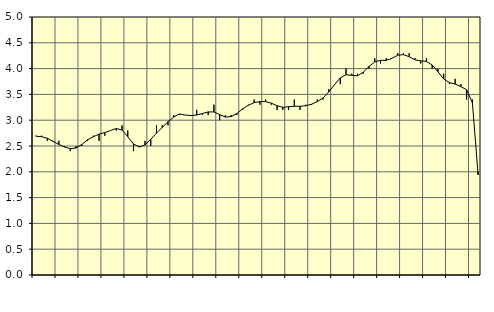
| Category | Piggar | Series 1 |
|---|---|---|
| nan | 2.7 | 2.69 |
| 1.0 | 2.7 | 2.68 |
| 1.0 | 2.6 | 2.65 |
| 1.0 | 2.6 | 2.59 |
| nan | 2.6 | 2.53 |
| 2.0 | 2.5 | 2.48 |
| 2.0 | 2.4 | 2.45 |
| 2.0 | 2.5 | 2.46 |
| nan | 2.5 | 2.53 |
| 3.0 | 2.6 | 2.62 |
| 3.0 | 2.7 | 2.68 |
| 3.0 | 2.6 | 2.73 |
| nan | 2.7 | 2.76 |
| 4.0 | 2.8 | 2.8 |
| 4.0 | 2.8 | 2.84 |
| 4.0 | 2.9 | 2.81 |
| nan | 2.8 | 2.68 |
| 5.0 | 2.4 | 2.54 |
| 5.0 | 2.5 | 2.48 |
| 5.0 | 2.6 | 2.52 |
| nan | 2.5 | 2.63 |
| 6.0 | 2.9 | 2.75 |
| 6.0 | 2.9 | 2.86 |
| 6.0 | 2.9 | 2.97 |
| nan | 3.1 | 3.06 |
| 7.0 | 3.1 | 3.12 |
| 7.0 | 3.1 | 3.1 |
| 7.0 | 3.1 | 3.09 |
| nan | 3.2 | 3.1 |
| 8.0 | 3.1 | 3.13 |
| 8.0 | 3.1 | 3.16 |
| 8.0 | 3.3 | 3.16 |
| nan | 3 | 3.11 |
| 9.0 | 3.1 | 3.06 |
| 9.0 | 3.1 | 3.07 |
| 9.0 | 3.1 | 3.13 |
| nan | 3.2 | 3.22 |
| 10.0 | 3.3 | 3.29 |
| 10.0 | 3.4 | 3.34 |
| 10.0 | 3.3 | 3.36 |
| nan | 3.4 | 3.36 |
| 11.0 | 3.3 | 3.33 |
| 11.0 | 3.2 | 3.28 |
| 11.0 | 3.2 | 3.25 |
| nan | 3.2 | 3.26 |
| 12.0 | 3.4 | 3.27 |
| 12.0 | 3.2 | 3.27 |
| 12.0 | 3.3 | 3.28 |
| nan | 3.3 | 3.31 |
| 13.0 | 3.4 | 3.36 |
| 13.0 | 3.4 | 3.43 |
| 13.0 | 3.6 | 3.55 |
| nan | 3.7 | 3.69 |
| 14.0 | 3.7 | 3.82 |
| 14.0 | 4 | 3.88 |
| 14.0 | 3.9 | 3.87 |
| nan | 3.9 | 3.86 |
| 15.0 | 3.9 | 3.93 |
| 15.0 | 4 | 4.04 |
| 15.0 | 4.2 | 4.13 |
| nan | 4.1 | 4.16 |
| 16.0 | 4.2 | 4.16 |
| 16.0 | 4.2 | 4.2 |
| 16.0 | 4.3 | 4.26 |
| nan | 4.3 | 4.27 |
| 17.0 | 4.3 | 4.23 |
| 17.0 | 4.2 | 4.17 |
| 17.0 | 4.1 | 4.15 |
| nan | 4.2 | 4.14 |
| 18.0 | 4 | 4.07 |
| 18.0 | 4 | 3.94 |
| 18.0 | 3.9 | 3.8 |
| nan | 3.7 | 3.73 |
| 19.0 | 3.8 | 3.7 |
| 19.0 | 3.7 | 3.65 |
| 19.0 | 3.4 | 3.59 |
| nan | 3.4 | 3.34 |
| 20.0 | 2 | 1.94 |